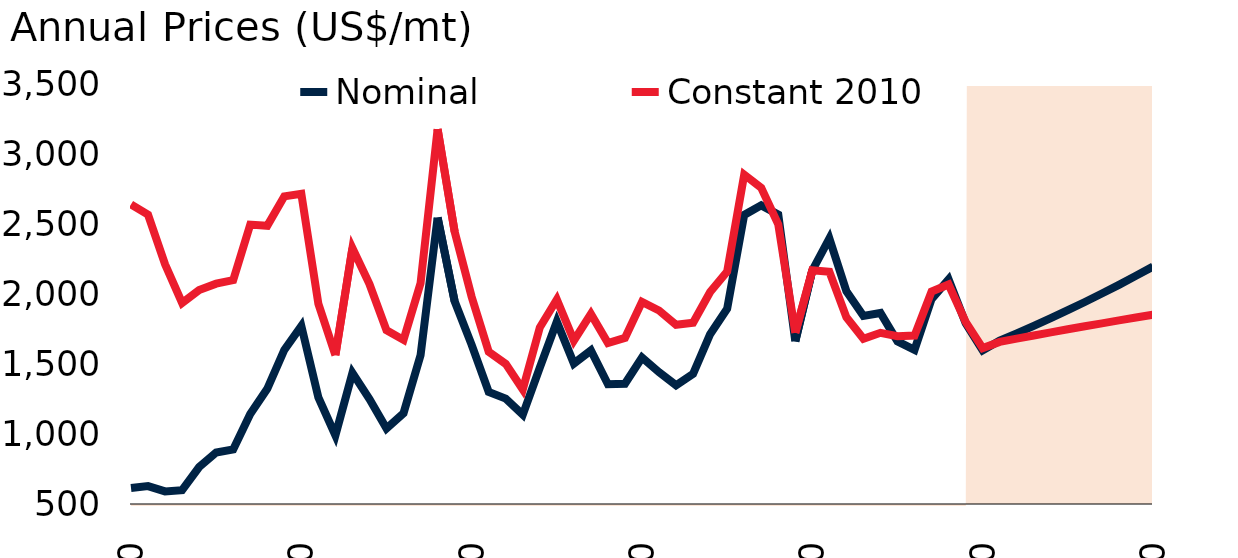
| Category | Nominal | Constant 2010 |
|---|---|---|
| 1970.0 | 614.17 | 2645.621 |
| 1971.0 | 627.949 | 2572.019 |
| 1972.0 | 590.103 | 2215.713 |
| 1973.0 | 599.105 | 1939.694 |
| 1974.0 | 764.819 | 2031.936 |
| 1975.0 | 868.437 | 2077.458 |
| 1976.0 | 889.932 | 2103.064 |
| 1977.0 | 1143.83 | 2500.597 |
| 1978.0 | 1324.922 | 2492.435 |
| 1979.0 | 1602.868 | 2703.044 |
| 1980.0 | 1774.913 | 2721.242 |
| 1981.0 | 1262.73 | 1933.771 |
| 1982.0 | 991.567 | 1565.122 |
| 1983.0 | 1438.433 | 2332.322 |
| 1984.0 | 1251.325 | 2074.595 |
| 1985.0 | 1040.725 | 1743.62 |
| 1986.0 | 1149.935 | 1675.053 |
| 1987.0 | 1565.361 | 2080.761 |
| 1988.0 | 2550.456 | 3183.567 |
| 1989.0 | 1951.257 | 2450.307 |
| 1990.0 | 1639.445 | 1983.063 |
| 1991.0 | 1302.188 | 1589.738 |
| 1992.0 | 1254.283 | 1503.159 |
| 1993.0 | 1139.049 | 1319.526 |
| 1994.0 | 1476.782 | 1763.745 |
| 1995.0 | 1805.658 | 1964.379 |
| 1996.0 | 1505.661 | 1669.828 |
| 1997.0 | 1599.33 | 1861.371 |
| 1998.0 | 1357.469 | 1652.007 |
| 1999.0 | 1361.09 | 1688.878 |
| 2000.0 | 1549.141 | 1947.144 |
| 2001.0 | 1443.634 | 1885.209 |
| 2002.0 | 1349.915 | 1783.648 |
| 2003.0 | 1431.294 | 1797.702 |
| 2004.0 | 1715.541 | 2017.665 |
| 2005.0 | 1898.308 | 2164.441 |
| 2006.0 | 2569.899 | 2857.788 |
| 2007.0 | 2638.179 | 2764.526 |
| 2008.0 | 2572.789 | 2501.888 |
| 2009.0 | 1664.83 | 1725.89 |
| 2010.0 | 2173.117 | 2173.117 |
| 2011.0 | 2401.387 | 2163.494 |
| 2012.0 | 2023.283 | 1836.424 |
| 2013.0 | 1846.669 | 1683.465 |
| 2014.0 | 1867.42 | 1725.618 |
| 2015.0 | 1664.681 | 1701.119 |
| 2016.0 | 1604.182 | 1705.965 |
| 2017.0 | 1967.654 | 2021.812 |
| 2018.0 | 2108.475 | 2071.607 |
| 2019.0 | 1794.488 | 1803.904 |
| 2020.0 | 1600 | 1616.333 |
| 2021.0 | 1670 | 1660.522 |
| 2022.0 | 1721.937 | 1683.945 |
| 2023.0 | 1775.488 | 1706.705 |
| 2024.0 | 1830.706 | 1728.955 |
| 2025.0 | 1887.64 | 1750.797 |
| 2026.0 | 1946.345 | 1772.297 |
| 2027.0 | 2006.876 | 1793.503 |
| 2028.0 | 2069.29 | 1814.445 |
| 2029.0 | 2133.644 | 1835.141 |
| 2030.0 | 2200 | 1855.605 |